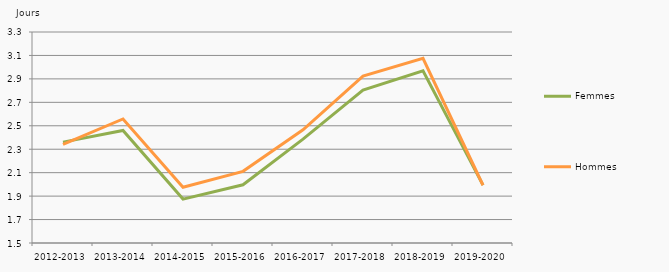
| Category | Femmes | Hommes |
|---|---|---|
| 2012-2013 | 2.36 | 2.341 |
| 2013-2014 | 2.46 | 2.558 |
| 2014-2015 | 1.874 | 1.976 |
| 2015-2016 | 1.997 | 2.111 |
| 2016-2017 | 2.386 | 2.465 |
| 2017-2018 | 2.804 | 2.923 |
| 2018-2019 | 2.968 | 3.075 |
| 2019-2020 | 1.993 | 1.993 |